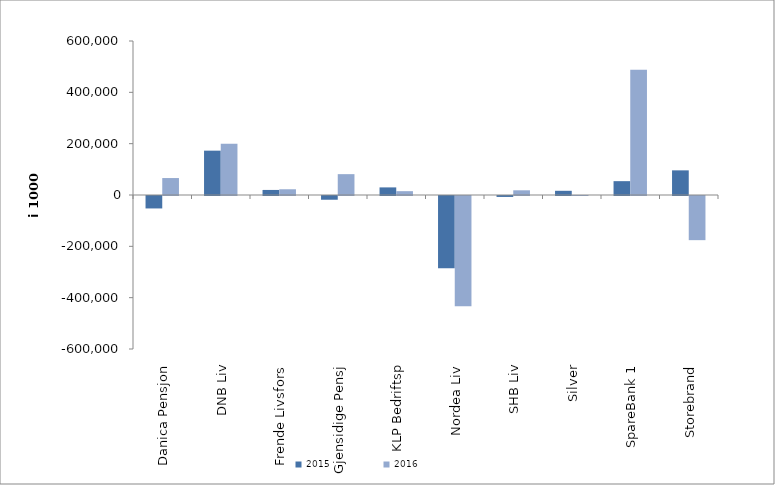
| Category | 2015 | 2016 |
|---|---|---|
| 0 | -48488.633 | 66036.539 |
| 1 | 172763 | 200017 |
| 2 | 19723.79 | 22327.125 |
| 3 | -14575.572 | 81229.822 |
| 4 | 29624 | 14951 |
| 5 | -281369.821 | -429389.115 |
| 6 | -3684 | 18281 |
| 7 | 16366.69 | -11 |
| 8 | 53939.984 | 488344.013 |
| 9 | 96039.801 | -172015.207 |